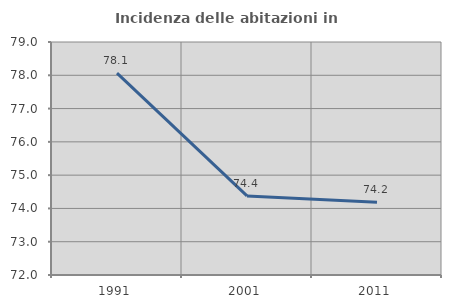
| Category | Incidenza delle abitazioni in proprietà  |
|---|---|
| 1991.0 | 78.067 |
| 2001.0 | 74.375 |
| 2011.0 | 74.184 |